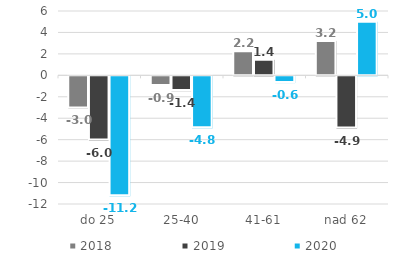
| Category | 2018 | 2019 | 2020 |
|---|---|---|---|
| do 25 | -2.993 | -5.989 | -11.176 |
| 25-40 | -0.891 | -1.379 | -4.835 |
| 41-61 | 2.245 | 1.445 | -0.628 |
| nad 62 | 3.212 | -4.874 | 4.99 |